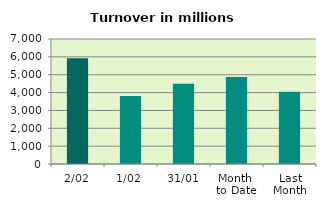
| Category | Series 0 |
|---|---|
| 2/02 | 5928.335 |
| 1/02 | 3806.763 |
| 31/01 | 4490.672 |
| Month 
to Date | 4867.549 |
| Last
Month | 4043.095 |